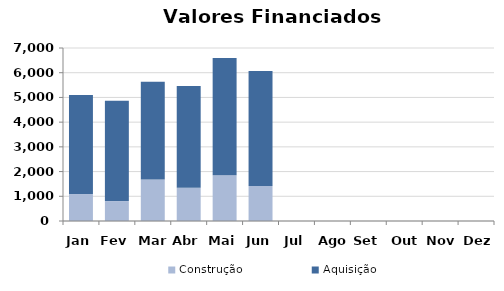
| Category | Construção | Aquisição  |
|---|---|---|
| Jan | 1091.225 | 4005.43 |
| Fev | 806.874 | 4059.044 |
| Mar | 1684.101 | 3954.739 |
| Abr | 1343.897 | 4119.704 |
| Mai | 1850.725 | 4740.725 |
| Jun | 1419.474 | 4644.895 |
| Jul | 0 | 0 |
| Ago | 0 | 0 |
| Set | 0 | 0 |
| Out | 0 | 0 |
| Nov | 0 | 0 |
| Dez | 0 | 0 |